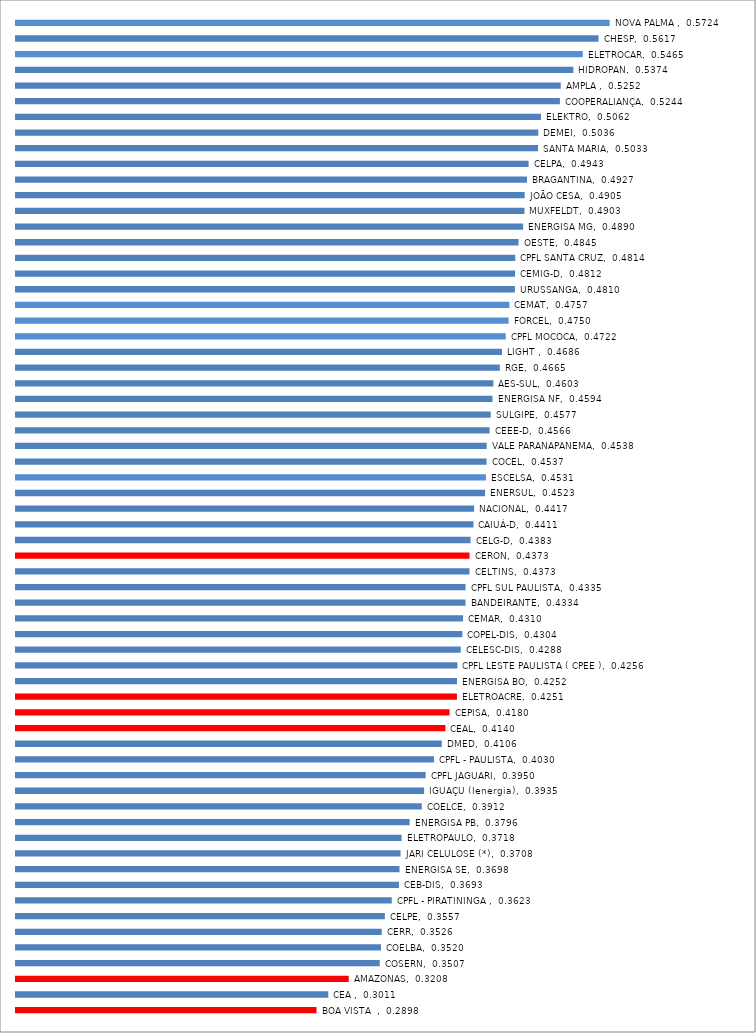
| Category | Series 0 |
|---|---|
| 0 | 0.29 |
| 1 | 0.301 |
| 2 | 0.321 |
| 3 | 0.351 |
| 4 | 0.352 |
| 5 | 0.353 |
| 6 | 0.356 |
| 7 | 0.362 |
| 8 | 0.369 |
| 9 | 0.37 |
| 10 | 0.371 |
| 11 | 0.372 |
| 12 | 0.38 |
| 13 | 0.391 |
| 14 | 0.394 |
| 15 | 0.395 |
| 16 | 0.403 |
| 17 | 0.411 |
| 18 | 0.414 |
| 19 | 0.418 |
| 20 | 0.425 |
| 21 | 0.425 |
| 22 | 0.426 |
| 23 | 0.429 |
| 24 | 0.43 |
| 25 | 0.431 |
| 26 | 0.433 |
| 27 | 0.433 |
| 28 | 0.437 |
| 29 | 0.437 |
| 30 | 0.438 |
| 31 | 0.441 |
| 32 | 0.442 |
| 33 | 0.452 |
| 34 | 0.453 |
| 35 | 0.454 |
| 36 | 0.454 |
| 37 | 0.457 |
| 38 | 0.458 |
| 39 | 0.459 |
| 40 | 0.46 |
| 41 | 0.466 |
| 42 | 0.469 |
| 43 | 0.472 |
| 44 | 0.475 |
| 45 | 0.476 |
| 46 | 0.481 |
| 47 | 0.481 |
| 48 | 0.481 |
| 49 | 0.485 |
| 50 | 0.489 |
| 51 | 0.49 |
| 52 | 0.49 |
| 53 | 0.493 |
| 54 | 0.494 |
| 55 | 0.503 |
| 56 | 0.504 |
| 57 | 0.506 |
| 58 | 0.524 |
| 59 | 0.525 |
| 60 | 0.537 |
| 61 | 0.547 |
| 62 | 0.562 |
| 63 | 0.572 |